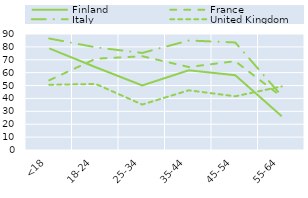
| Category | Finland | France | Italy | United Kingdom |
|---|---|---|---|---|
| <18 | 78.84 | 54.09 | 86.5 | 50.61 |
| 18-24 | 64.18 | 70.82 | 79.67 | 51.22 |
| 25-34 | 50.03 | 72.76 | 75.3 | 35.27 |
| 35-44 | 61.91 | 64.38 | 84.96 | 46.31 |
| 45-54 | 57.94 | 68.9 | 83.43 | 41.67 |
| 55-64 | 26.12 | 41.27 | 41.99 | 49.34 |